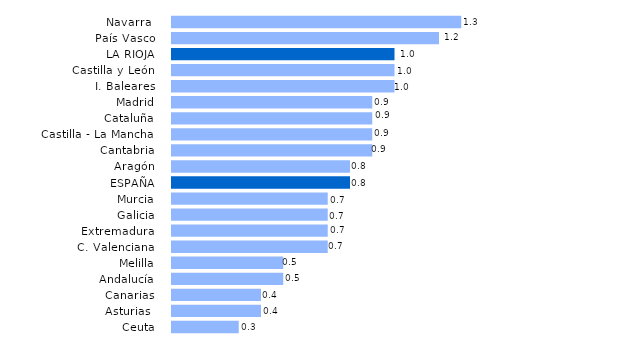
| Category | Series 0 |
|---|---|
| Ceuta | 0.3 |
| Asturias  | 0.4 |
| Canarias | 0.4 |
| Andalucía | 0.5 |
| Melilla | 0.5 |
| C. Valenciana | 0.7 |
| Extremadura | 0.7 |
| Galicia | 0.7 |
| Murcia | 0.7 |
| ESPAÑA | 0.8 |
| Aragón | 0.8 |
| Cantabria | 0.9 |
| Castilla - La Mancha | 0.9 |
| Cataluña | 0.9 |
| Madrid | 0.9 |
| I. Baleares | 1 |
| Castilla y León | 1 |
| LA RIOJA | 1 |
| País Vasco | 1.2 |
| Navarra  | 1.3 |